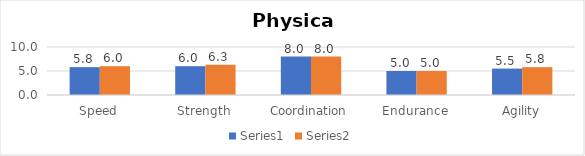
| Category | Series 0 | Series 1 |
|---|---|---|
| Speed | 5.8 | 6 |
| Strength | 6 | 6.3 |
| Coordination | 8 | 8 |
| Endurance | 5 | 5 |
| Agility | 5.5 | 5.8 |